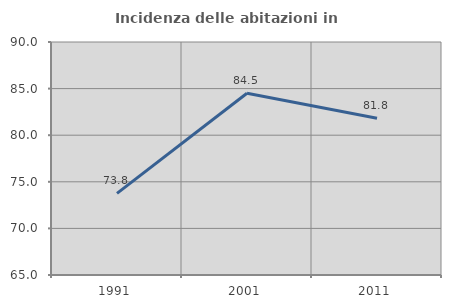
| Category | Incidenza delle abitazioni in proprietà  |
|---|---|
| 1991.0 | 73.763 |
| 2001.0 | 84.507 |
| 2011.0 | 81.818 |